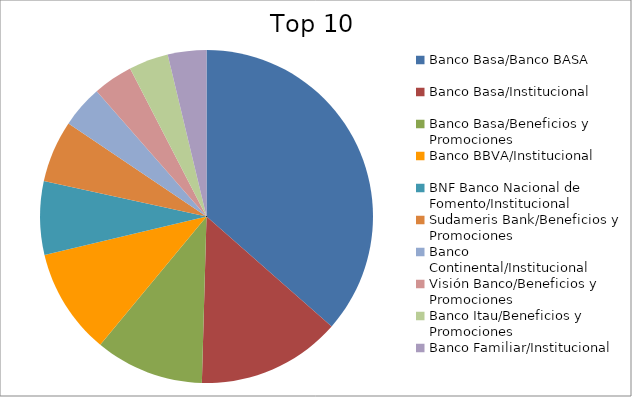
| Category | Series 0 |
|---|---|
| Banco Basa/Banco BASA | 32.78 |
| Banco Basa/Institucional | 12.56 |
| Banco Basa/Beneficios y Promociones | 9.5 |
| Banco BBVA/Institucional | 9.24 |
| BNF Banco Nacional de Fomento/Institucional | 6.41 |
| Sudameris Bank/Beneficios y Promociones | 5.41 |
| Banco Continental/Institucional | 3.68 |
| Visión Banco/Beneficios y Promociones | 3.48 |
| Banco Itau/Beneficios y Promociones | 3.45 |
| Banco Familiar/Institucional | 3.37 |